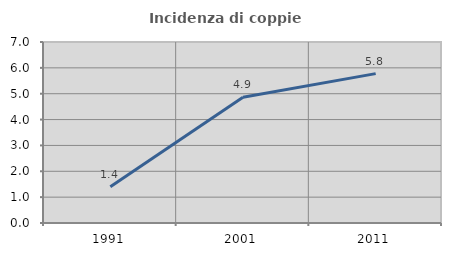
| Category | Incidenza di coppie miste |
|---|---|
| 1991.0 | 1.404 |
| 2001.0 | 4.866 |
| 2011.0 | 5.776 |